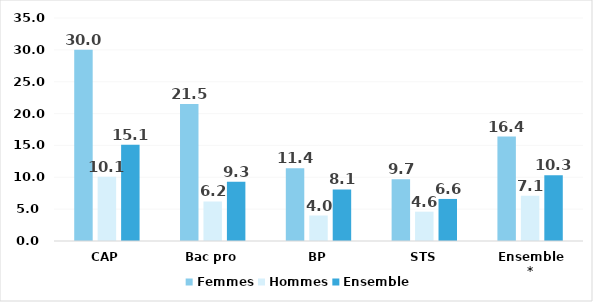
| Category | Femmes | Hommes | Ensemble |
|---|---|---|---|
| CAP | 30 | 10.1 | 15.1 |
| Bac pro | 21.5 | 6.2 | 9.3 |
| BP | 11.4 | 4 | 8.1 |
| STS | 9.7 | 4.6 | 6.6 |
| Ensemble* | 16.4 | 7.1 | 10.3 |